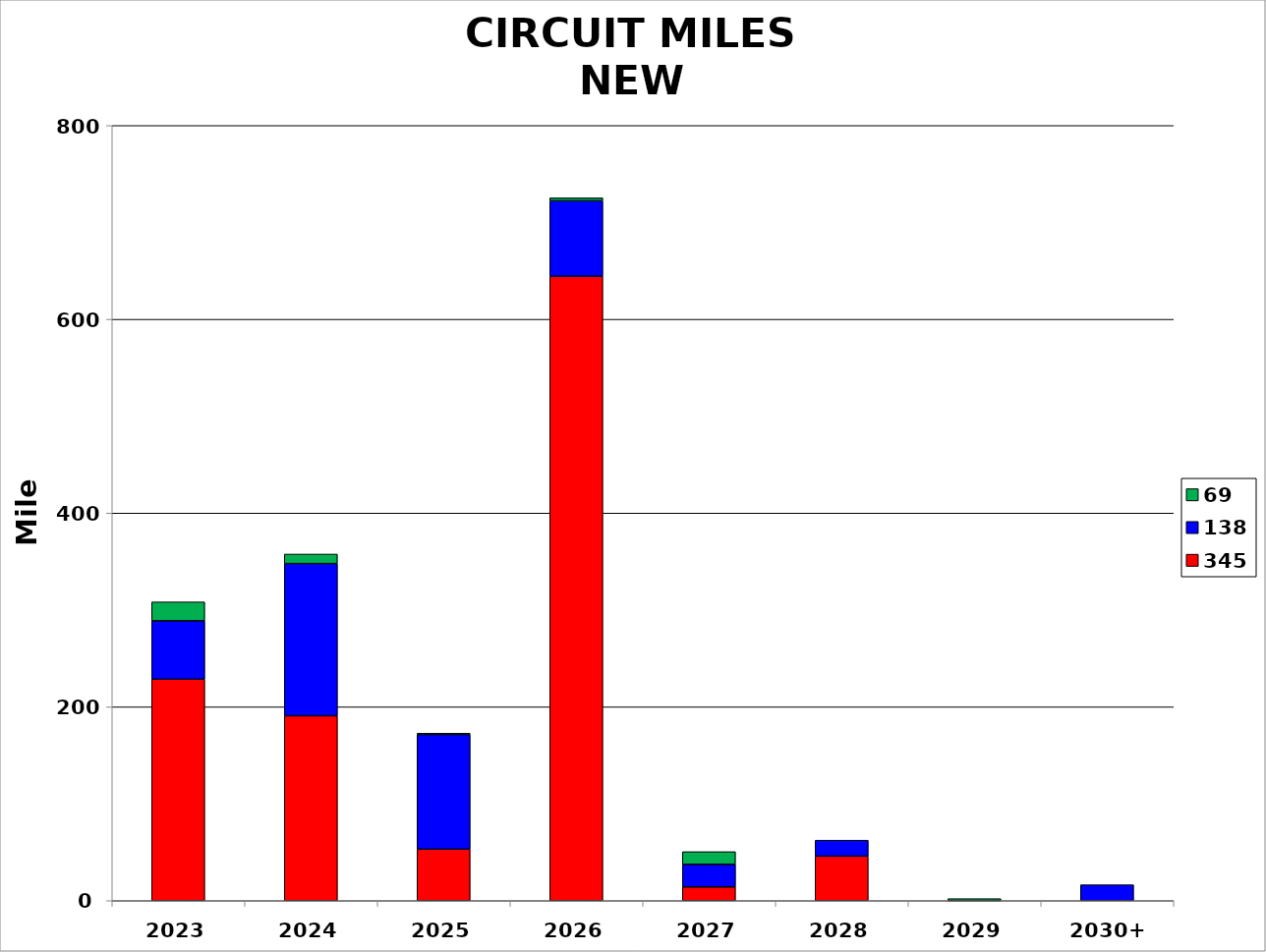
| Category | 345 | 138 | 69 |
|---|---|---|---|
| 2023 | 228.641 | 60.22 | 19.5 |
| 2024 | 190.84 | 157.084 | 9.8 |
| 2025 | 53.2 | 118.3 | 1.33 |
| 2026 | 644.47 | 77.9 | 3 |
| 2027 | 14.17 | 23.32 | 13.1 |
| 2028 | 46 | 16.44 | 0 |
| 2029 | 0 | 0.1 | 2 |
| 2030+ | 0 | 16.4 | 0 |